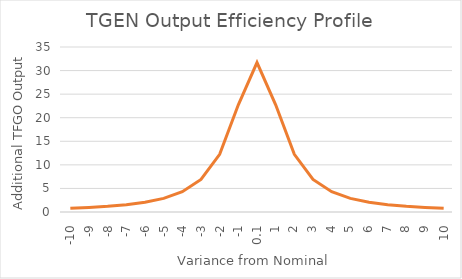
| Category | Series 1 |
|---|---|
| -10.0 | 0.776 |
| -9.0 | 0.953 |
| -8.0 | 1.197 |
| -7.0 | 1.545 |
| -6.0 | 2.067 |
| -5.0 | 2.894 |
| -4.0 | 4.301 |
| -3.0 | 6.92 |
| -2.0 | 12.243 |
| -1.0 | 22.736 |
| 0.1 | 31.704 |
| 1.0 | 22.736 |
| 2.0 | 12.243 |
| 3.0 | 6.92 |
| 4.0 | 4.301 |
| 5.0 | 2.894 |
| 6.0 | 2.067 |
| 7.0 | 1.545 |
| 8.0 | 1.197 |
| 9.0 | 0.953 |
| 10.0 | 0.776 |